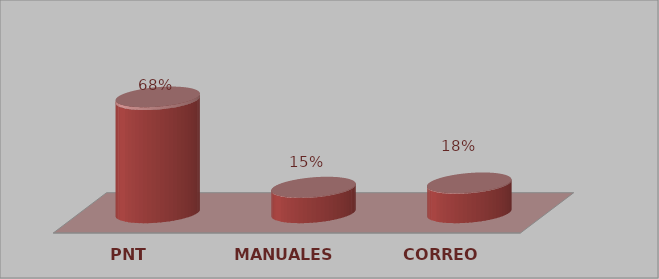
| Category | Series 0 | Series 1 |
|---|---|---|
| PNT | 27 | 0.675 |
| MANUALES | 6 | 0.15 |
| CORREO | 7 | 0.175 |